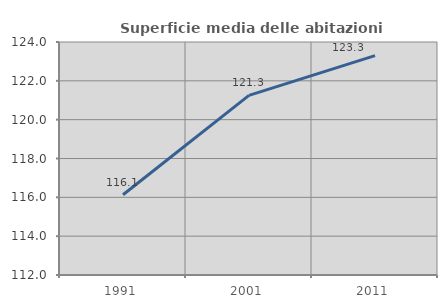
| Category | Superficie media delle abitazioni occupate |
|---|---|
| 1991.0 | 116.135 |
| 2001.0 | 121.25 |
| 2011.0 | 123.297 |